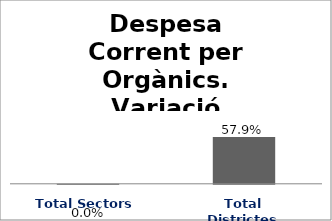
| Category | Series 0 |
|---|---|
| Total Sectors | 0 |
| Total Districtes | 0.579 |